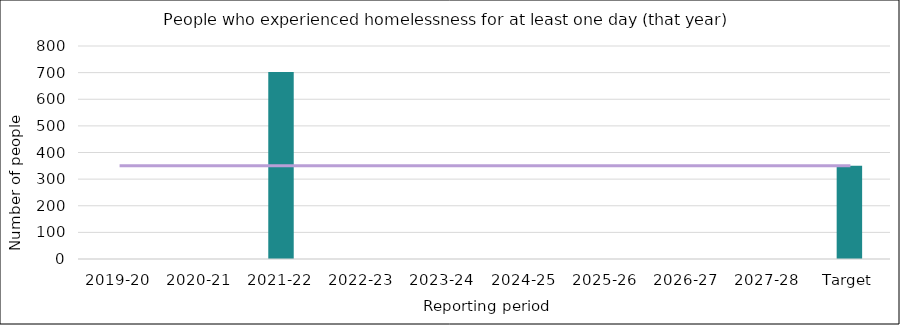
| Category | Series 0 |
|---|---|
| 2019-20 | 0 |
| 2020-21 | 0 |
| 2021-22 | 702 |
| 2022-23 | 0 |
| 2023-24 | 0 |
| 2024-25 | 0 |
| 2025-26 | 0 |
| 2026-27 | 0 |
| 2027-28 | 0 |
| Target | 350 |